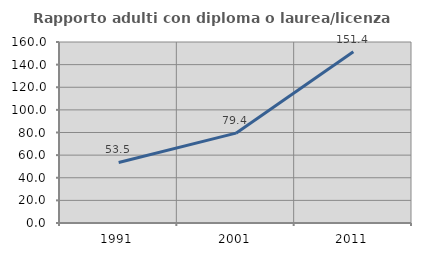
| Category | Rapporto adulti con diploma o laurea/licenza media  |
|---|---|
| 1991.0 | 53.533 |
| 2001.0 | 79.427 |
| 2011.0 | 151.397 |